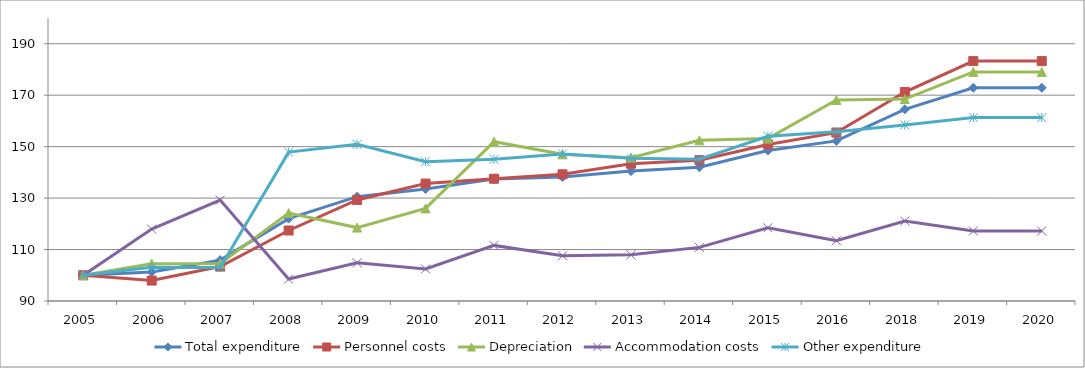
| Category | Total expenditure | Personnel costs | Depreciation | Accommodation costs | Other expenditure |
|---|---|---|---|---|---|
| 2005.0 | 100 | 100 | 100 | 100 | 100 |
| 2006.0 | 101.301 | 97.949 | 104.506 | 117.948 | 103.111 |
| 2007.0 | 105.876 | 103.387 | 104.584 | 129.213 | 102.991 |
| 2008.0 | 122.03 | 117.407 | 124.16 | 98.531 | 147.864 |
| 2009.0 | 130.557 | 129.274 | 118.537 | 104.856 | 150.913 |
| 2010.0 | 133.535 | 135.64 | 125.999 | 102.477 | 144.12 |
| 2011.0 | 137.387 | 137.525 | 151.917 | 111.609 | 145.079 |
| 2012.0 | 138.226 | 139.248 | 147.003 | 107.587 | 147.164 |
| 2013.0 | 140.495 | 143.356 | 145.723 | 107.943 | 145.466 |
| 2014.0 | 142 | 144.734 | 152.46 | 110.841 | 145.114 |
| 2015.0 | 148.497 | 150.859 | 153.115 | 118.473 | 154.039 |
| 2016.0 | 152.229 | 155.452 | 168.123 | 113.419 | 155.827 |
| 2018.0 | 164.501 | 171.221 | 168.495 | 121.086 | 158.442 |
| 2019.0 | 172.878 | 183.247 | 179.033 | 117.22 | 161.294 |
| 2020.0 | 172.878 | 183.247 | 179.033 | 117.22 | 161.294 |